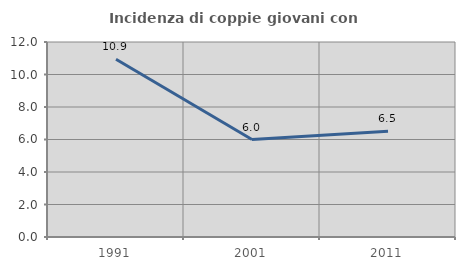
| Category | Incidenza di coppie giovani con figli |
|---|---|
| 1991.0 | 10.936 |
| 2001.0 | 5.998 |
| 2011.0 | 6.503 |